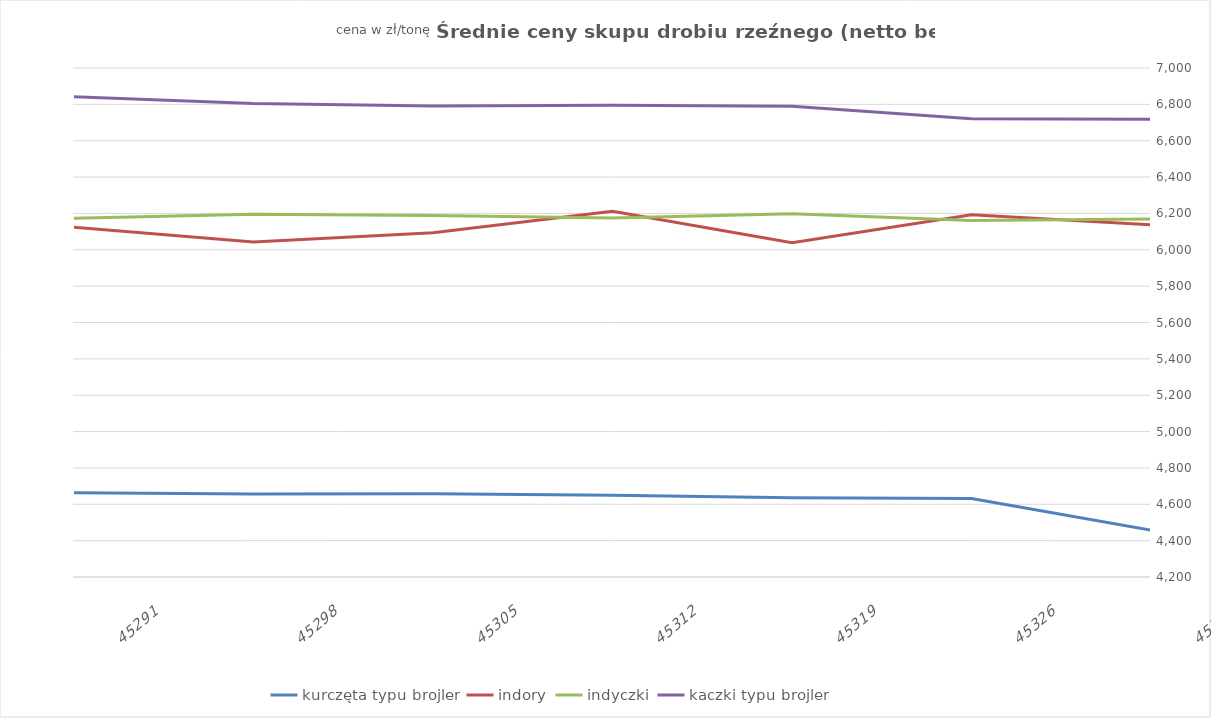
| Category | kurczęta typu brojler | indory | indyczki | kaczki typu brojler |
|---|---|---|---|---|
| 12/31/23 | 4663.689 | 6124.488 | 6173.581 | 6842.093 |
| 1/7/24 | 4656.999 | 6042.899 | 6195.536 | 6804.711 |
| 1/14/24 | 4657.301 | 6093.408 | 6188.469 | 6791.49 |
| 1/21/24 | 4649.368 | 6211.743 | 6174.662 | 6795.51 |
| 1/28/24 | 4635.346 | 6038.883 | 6198.268 | 6789.984 |
| 2/4/24 | 4631.706 | 6192.99 | 6161.473 | 6720.307 |
| 2/11/24 | 4457.511 | 6137.802 | 6169.464 | 6717.71 |